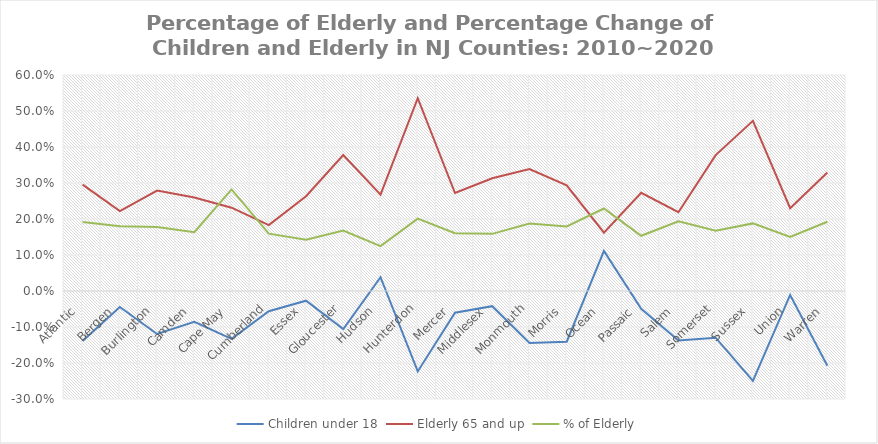
| Category | Children under 18 | Elderly 65 and up | % of Elderly |
|---|---|---|---|
| Atlantic  | -0.139 | 0.296 | 0.192 |
| Bergen  | -0.045 | 0.222 | 0.18 |
| Burlington  | -0.119 | 0.279 | 0.178 |
| Camden  | -0.086 | 0.26 | 0.163 |
| Cape May  | -0.133 | 0.231 | 0.282 |
| Cumberland | -0.056 | 0.183 | 0.159 |
| Essex  | -0.027 | 0.263 | 0.142 |
| Gloucester | -0.106 | 0.378 | 0.168 |
| Hudson  | 0.038 | 0.268 | 0.125 |
| Hunterdon | -0.223 | 0.536 | 0.201 |
| Mercer  | -0.06 | 0.272 | 0.161 |
| Middlesex  | -0.042 | 0.313 | 0.159 |
| Monmouth | -0.144 | 0.339 | 0.188 |
| Morris  | -0.141 | 0.293 | 0.179 |
| Ocean  | 0.111 | 0.162 | 0.229 |
| Passaic  | -0.05 | 0.273 | 0.153 |
| Salem  | -0.137 | 0.219 | 0.194 |
| Somerset | -0.13 | 0.377 | 0.167 |
| Sussex  | -0.25 | 0.473 | 0.188 |
| Union  | -0.011 | 0.23 | 0.15 |
| Warren  | -0.208 | 0.329 | 0.192 |